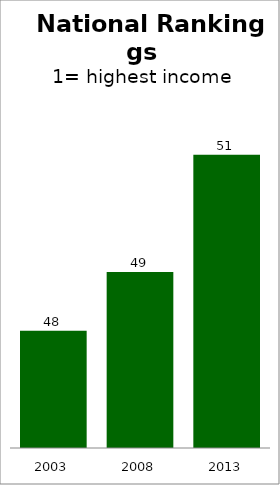
| Category | State |
|---|---|
| 2003.0 | 48 |
| 2008.0 | 49 |
| 2013.0 | 51 |